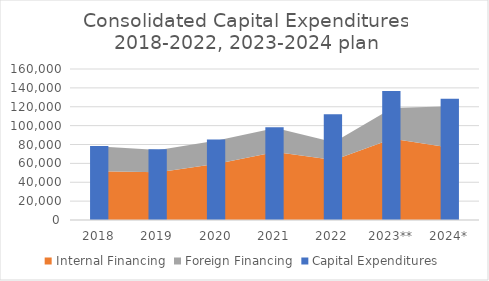
| Category | Capital Expenditures |
|---|---|
| 2018 | 78434.38 |
| 2019 | 74992.61 |
| 2020 | 85308.57 |
| 2021 | 98202.62 |
| 2022 | 112116.6 |
| 2023** | 136626.177 |
| 2024* | 128458 |